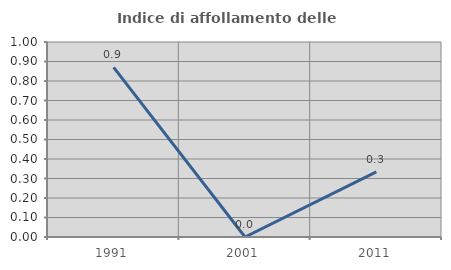
| Category | Indice di affollamento delle abitazioni  |
|---|---|
| 1991.0 | 0.87 |
| 2001.0 | 0 |
| 2011.0 | 0.334 |